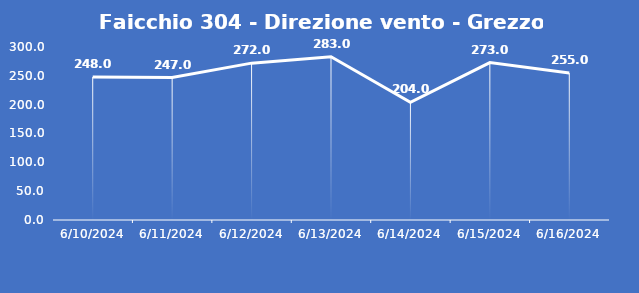
| Category | Faicchio 304 - Direzione vento - Grezzo (°N) |
|---|---|
| 6/10/24 | 248 |
| 6/11/24 | 247 |
| 6/12/24 | 272 |
| 6/13/24 | 283 |
| 6/14/24 | 204 |
| 6/15/24 | 273 |
| 6/16/24 | 255 |